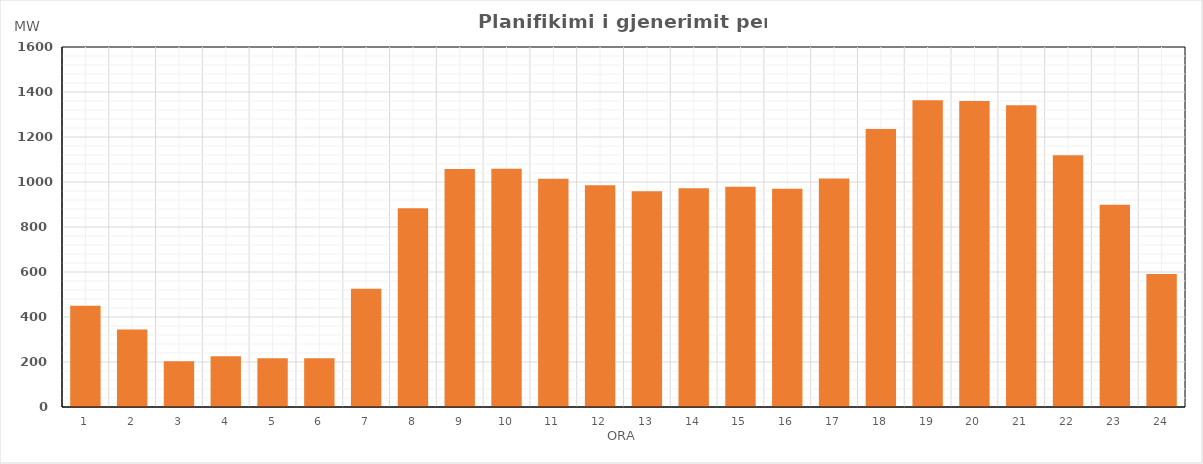
| Category | Max (MW) |
|---|---|
| 0 | 450.537 |
| 1 | 344.353 |
| 2 | 203.649 |
| 3 | 225.054 |
| 4 | 216.494 |
| 5 | 216.448 |
| 6 | 525.158 |
| 7 | 883.633 |
| 8 | 1058.239 |
| 9 | 1058.976 |
| 10 | 1014.155 |
| 11 | 985.666 |
| 12 | 958.607 |
| 13 | 971.92 |
| 14 | 978.523 |
| 15 | 970.261 |
| 16 | 1015.746 |
| 17 | 1236.104 |
| 18 | 1363.739 |
| 19 | 1359.534 |
| 20 | 1341.288 |
| 21 | 1118.691 |
| 22 | 898.509 |
| 23 | 591.25 |